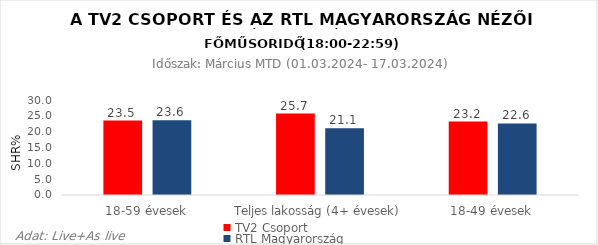
| Category | TV2 Csoport | RTL Magyarország |
|---|---|---|
| 18-59 évesek | 23.5 | 23.6 |
| Teljes lakosság (4+ évesek) | 25.7 | 21.1 |
| 18-49 évesek | 23.2 | 22.6 |